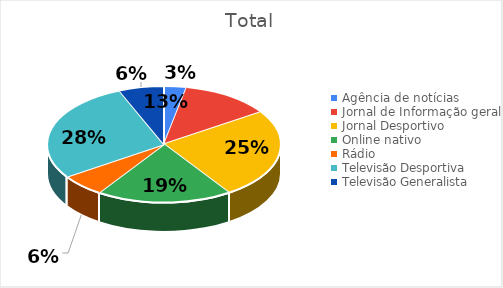
| Category | Total |
|---|---|
| Agência de notícias | 1 |
| Jornal de Informação geral | 4 |
| Jornal Desportivo | 8 |
| Online nativo | 6 |
| Rádio | 2 |
| Televisão Desportiva | 9 |
| Televisão Generalista | 2 |